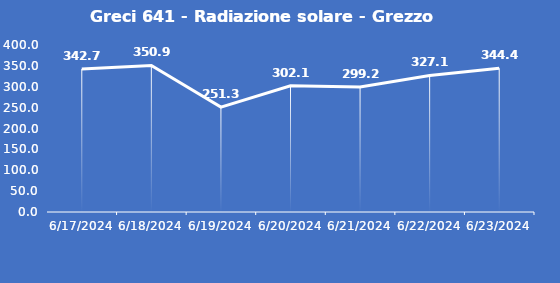
| Category | Greci 641 - Radiazione solare - Grezzo (W/m2) |
|---|---|
| 6/17/24 | 342.7 |
| 6/18/24 | 350.9 |
| 6/19/24 | 251.3 |
| 6/20/24 | 302.1 |
| 6/21/24 | 299.2 |
| 6/22/24 | 327.1 |
| 6/23/24 | 344.4 |